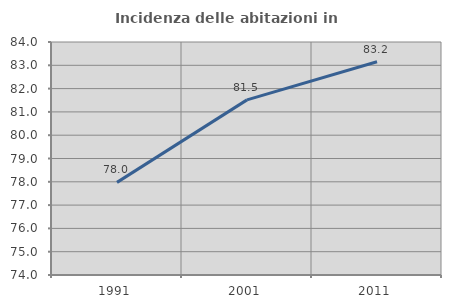
| Category | Incidenza delle abitazioni in proprietà  |
|---|---|
| 1991.0 | 77.975 |
| 2001.0 | 81.516 |
| 2011.0 | 83.152 |